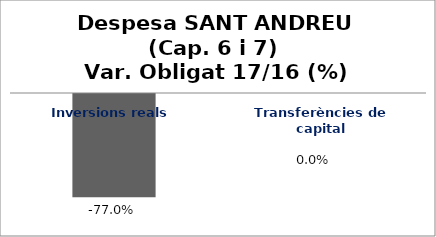
| Category | Series 0 |
|---|---|
| Inversions reals | -0.77 |
| Transferències de capital | 0 |